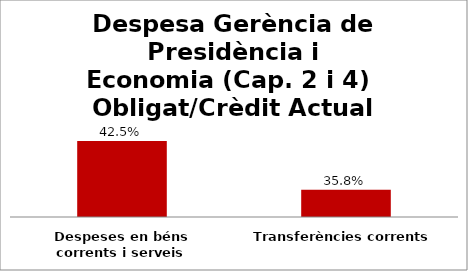
| Category | Series 0 |
|---|---|
| Despeses en béns corrents i serveis | 0.425 |
| Transferències corrents | 0.358 |